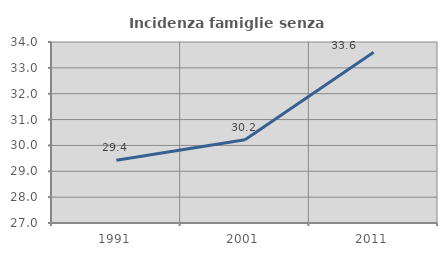
| Category | Incidenza famiglie senza nuclei |
|---|---|
| 1991.0 | 29.429 |
| 2001.0 | 30.216 |
| 2011.0 | 33.602 |